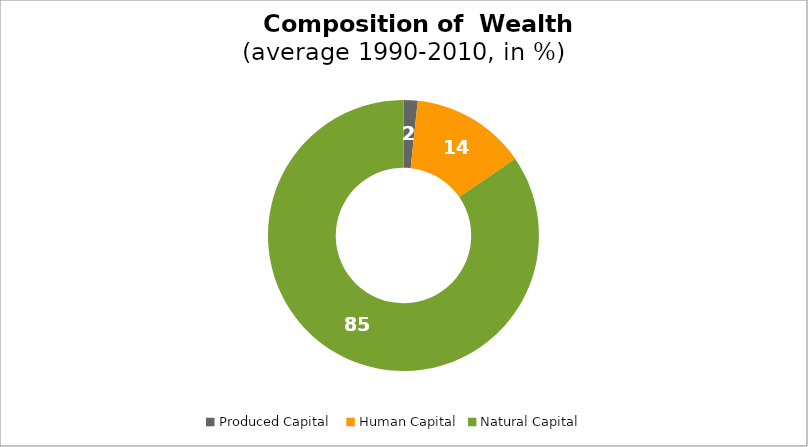
| Category | Series 0 |
|---|---|
| Produced Capital  | 1.683 |
| Human Capital | 13.728 |
| Natural Capital | 84.589 |